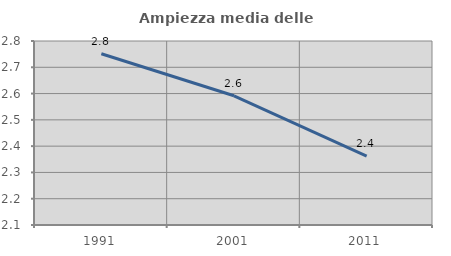
| Category | Ampiezza media delle famiglie |
|---|---|
| 1991.0 | 2.751 |
| 2001.0 | 2.592 |
| 2011.0 | 2.362 |